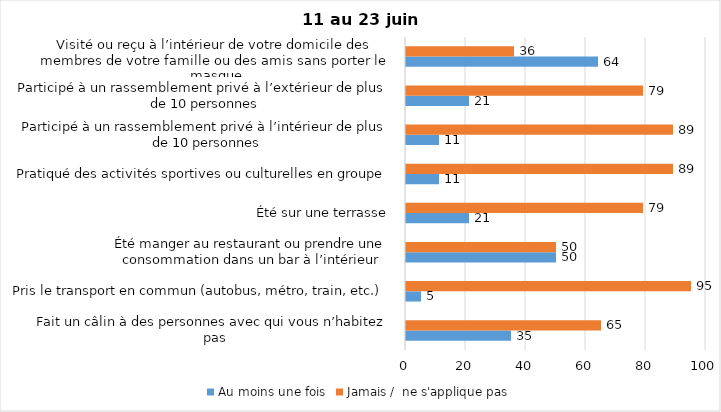
| Category | Au moins une fois | Jamais /  ne s'applique pas |
|---|---|---|
| Fait un câlin à des personnes avec qui vous n’habitez pas | 35 | 65 |
| Pris le transport en commun (autobus, métro, train, etc.) | 5 | 95 |
| Été manger au restaurant ou prendre une consommation dans un bar à l’intérieur | 50 | 50 |
| Été sur une terrasse | 21 | 79 |
| Pratiqué des activités sportives ou culturelles en groupe | 11 | 89 |
| Participé à un rassemblement privé à l’intérieur de plus de 10 personnes | 11 | 89 |
| Participé à un rassemblement privé à l’extérieur de plus de 10 personnes | 21 | 79 |
| Visité ou reçu à l’intérieur de votre domicile des membres de votre famille ou des amis sans porter le masque | 64 | 36 |